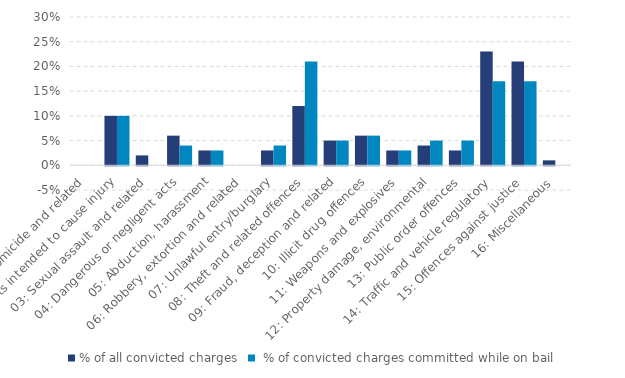
| Category | % of all convicted charges |  % of convicted charges committed while on bail |
|---|---|---|
| 01: Homicide and related | 0 | 0 |
| 02: Acts intended to cause injury | 0.1 | 0.1 |
| 03: Sexual assault and related | 0.02 | 0 |
| 04: Dangerous or negligent acts | 0.06 | 0.04 |
| 05: Abduction, harassment | 0.03 | 0.03 |
| 06: Robbery, extortion and related | 0 | 0 |
| 07: Unlawful entry/burglary | 0.03 | 0.04 |
| 08: Theft and related offences | 0.12 | 0.21 |
| 09: Fraud, deception and related | 0.05 | 0.05 |
| 10: Illicit drug offences | 0.06 | 0.06 |
| 11: Weapons and explosives | 0.03 | 0.03 |
| 12: Property damage, environmental | 0.04 | 0.05 |
| 13: Public order offences | 0.03 | 0.05 |
| 14: Traffic and vehicle regulatory | 0.23 | 0.17 |
| 15: Offences against justice | 0.21 | 0.17 |
| 16: Miscellaneous | 0.01 | 0 |